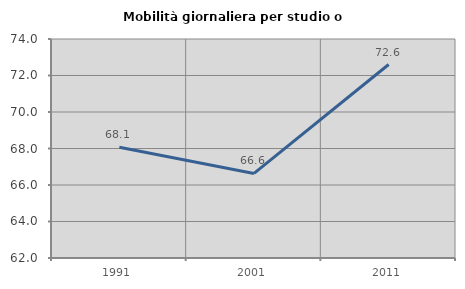
| Category | Mobilità giornaliera per studio o lavoro |
|---|---|
| 1991.0 | 68.069 |
| 2001.0 | 66.633 |
| 2011.0 | 72.601 |